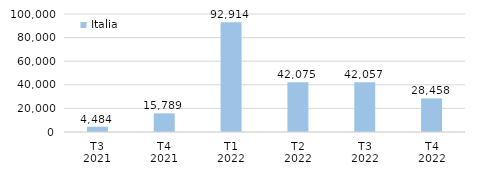
| Category | Italia |
|---|---|
| T3
2021 | 4484.196 |
| T4
2021 | 15789.152 |
| T1
2022 | 92913.756 |
| T2
2022 | 42075.209 |
| T3
2022 | 42056.837 |
| T4
2022 | 28457.543 |